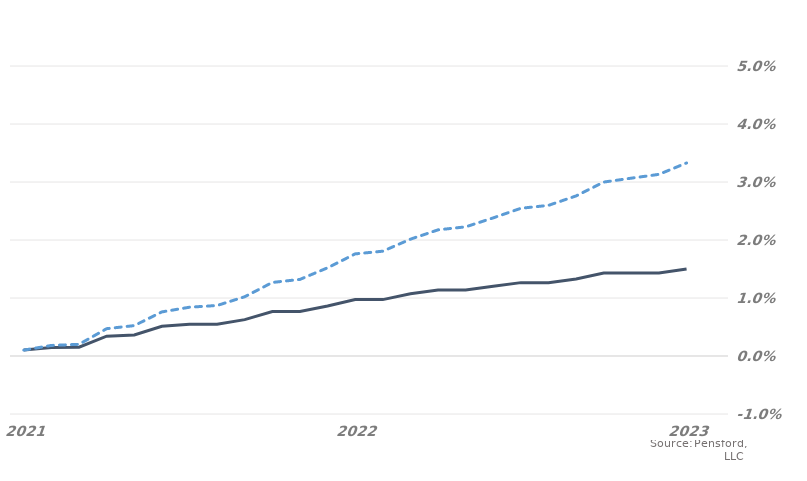
| Category | MARKET EXPECTATIONS | +1 Standard Deviation |
|---|---|---|
| 2021-12-30 | 0.001 | 0.001 |
| 2022-01-30 | 0.001 | 0.002 |
| 2022-02-28 | 0.002 | 0.002 |
| 2022-03-28 | 0.003 | 0.005 |
| 2022-04-28 | 0.004 | 0.005 |
| 2022-05-28 | 0.005 | 0.008 |
| 2022-06-28 | 0.005 | 0.008 |
| 2022-07-28 | 0.005 | 0.009 |
| 2022-08-28 | 0.006 | 0.01 |
| 2022-09-28 | 0.008 | 0.013 |
| 2022-10-28 | 0.008 | 0.013 |
| 2022-11-28 | 0.009 | 0.015 |
| 2022-12-28 | 0.01 | 0.018 |
| 2023-01-28 | 0.01 | 0.018 |
| 2023-02-28 | 0.011 | 0.02 |
| 2023-03-28 | 0.011 | 0.022 |
| 2023-04-28 | 0.011 | 0.022 |
| 2023-05-28 | 0.012 | 0.024 |
| 2023-06-28 | 0.013 | 0.025 |
| 2023-07-28 | 0.013 | 0.026 |
| 2023-08-28 | 0.013 | 0.028 |
| 2023-09-28 | 0.014 | 0.03 |
| 2023-10-28 | 0.014 | 0.031 |
| 2023-11-28 | 0.014 | 0.031 |
| 2023-12-28 | 0.015 | 0.033 |
| 2024-01-28 | 0.015 | 0.034 |
| 2024-02-28 | 0.015 | 0.034 |
| 2024-03-28 | 0.015 | 0.034 |
| 2024-04-28 | 0.015 | 0.035 |
| 2024-05-28 | 0.015 | 0.035 |
| 2024-06-28 | 0.015 | 0.036 |
| 2024-07-28 | 0.015 | 0.036 |
| 2024-08-28 | 0.015 | 0.036 |
| 2024-09-28 | 0.015 | 0.037 |
| 2024-10-28 | 0.015 | 0.037 |
| 2024-11-28 | 0.015 | 0.037 |
| 2024-12-28 | 0.015 | 0.037 |
| 2025-01-28 | 0.015 | 0.038 |
| 2025-02-28 | 0.015 | 0.038 |
| 2025-03-28 | 0.015 | 0.038 |
| 2025-04-28 | 0.015 | 0.039 |
| 2025-05-28 | 0.015 | 0.039 |
| 2025-06-28 | 0.015 | 0.039 |
| 2025-07-28 | 0.015 | 0.039 |
| 2025-08-28 | 0.015 | 0.04 |
| 2025-09-28 | 0.015 | 0.04 |
| 2025-10-28 | 0.015 | 0.04 |
| 2025-11-28 | 0.015 | 0.04 |
| 2025-12-28 | 0.015 | 0.041 |
| 2026-01-28 | 0.015 | 0.041 |
| 2026-02-28 | 0.015 | 0.041 |
| 2026-03-28 | 0.015 | 0.042 |
| 2026-04-28 | 0.015 | 0.042 |
| 2026-05-28 | 0.015 | 0.042 |
| 2026-06-28 | 0.015 | 0.042 |
| 2026-07-28 | 0.015 | 0.043 |
| 2026-08-28 | 0.015 | 0.043 |
| 2026-09-28 | 0.015 | 0.043 |
| 2026-10-28 | 0.015 | 0.043 |
| 2026-11-28 | 0.015 | 0.043 |
| 2026-12-28 | 0.016 | 0.045 |
| 2027-01-28 | 0.016 | 0.045 |
| 2027-02-28 | 0.016 | 0.046 |
| 2027-03-28 | 0.016 | 0.046 |
| 2027-04-28 | 0.016 | 0.046 |
| 2027-05-28 | 0.016 | 0.046 |
| 2027-06-28 | 0.016 | 0.046 |
| 2027-07-28 | 0.016 | 0.047 |
| 2027-08-28 | 0.016 | 0.047 |
| 2027-09-28 | 0.016 | 0.047 |
| 2027-10-28 | 0.016 | 0.047 |
| 2027-11-28 | 0.016 | 0.047 |
| 2027-12-28 | 0.017 | 0.048 |
| 2028-01-28 | 0.017 | 0.049 |
| 2028-02-28 | 0.017 | 0.049 |
| 2028-03-28 | 0.017 | 0.049 |
| 2028-04-28 | 0.017 | 0.049 |
| 2028-05-28 | 0.017 | 0.049 |
| 2028-06-28 | 0.017 | 0.05 |
| 2028-07-28 | 0.017 | 0.05 |
| 2028-08-28 | 0.017 | 0.05 |
| 2028-09-28 | 0.017 | 0.05 |
| 2028-10-28 | 0.017 | 0.051 |
| 2028-11-28 | 0.017 | 0.051 |
| 2028-12-28 | 0.017 | 0.052 |
| 2029-01-28 | 0.017 | 0.053 |
| 2029-02-28 | 0.017 | 0.053 |
| 2029-03-28 | 0.017 | 0.053 |
| 2029-04-28 | 0.017 | 0.053 |
| 2029-05-28 | 0.017 | 0.054 |
| 2029-06-28 | 0.017 | 0.054 |
| 2029-07-28 | 0.017 | 0.054 |
| 2029-08-28 | 0.017 | 0.054 |
| 2029-09-28 | 0.017 | 0.054 |
| 2029-10-28 | 0.017 | 0.054 |
| 2029-11-28 | 0.017 | 0.054 |
| 2029-12-28 | 0.017 | 0.055 |
| 2030-01-28 | 0.017 | 0.055 |
| 2030-02-28 | 0.017 | 0.055 |
| 2030-03-28 | 0.017 | 0.055 |
| 2030-04-28 | 0.017 | 0.055 |
| 2030-05-28 | 0.017 | 0.056 |
| 2030-06-28 | 0.017 | 0.056 |
| 2030-07-28 | 0.017 | 0.056 |
| 2030-08-28 | 0.017 | 0.056 |
| 2030-09-28 | 0.017 | 0.056 |
| 2030-10-28 | 0.017 | 0.056 |
| 2030-11-28 | 0.017 | 0.056 |
| 2030-12-28 | 0.018 | 0.058 |
| 2031-01-28 | 0.018 | 0.059 |
| 2031-02-28 | 0.018 | 0.059 |
| 2031-03-28 | 0.018 | 0.059 |
| 2031-04-28 | 0.018 | 0.059 |
| 2031-05-28 | 0.018 | 0.059 |
| 2031-06-28 | 0.018 | 0.059 |
| 2031-07-28 | 0.018 | 0.06 |
| 2031-08-28 | 0.018 | 0.06 |
| 2031-09-28 | 0.018 | 0.06 |
| 2031-10-28 | 0.018 | 0.06 |
| 2031-11-28 | 0.018 | 0.06 |